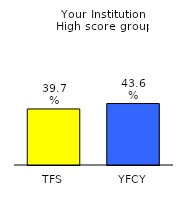
| Category | Series 0 |
|---|---|
| TFS | 0.397 |
| YFCY | 0.436 |